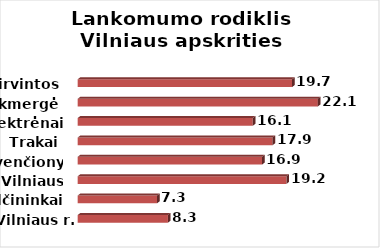
| Category | Series 0 |
|---|---|
| Vilniaus r. | 8.29 |
| Šalčininkai | 7.29 |
| Vilniaus m. | 19.17 |
| Švenčionys | 16.94 |
| Trakai | 17.9 |
| Elektrėnai | 16.08 |
| Ukmergė | 22.06 |
| Širvintos | 19.69 |